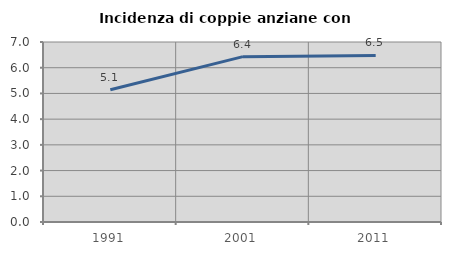
| Category | Incidenza di coppie anziane con figli |
|---|---|
| 1991.0 | 5.141 |
| 2001.0 | 6.431 |
| 2011.0 | 6.478 |